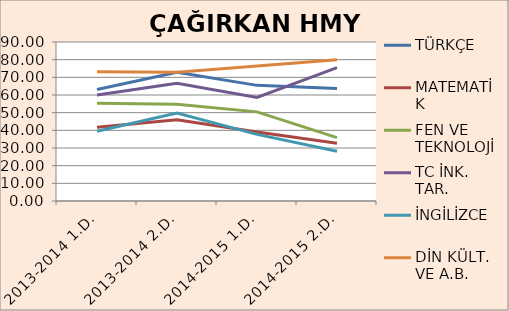
| Category | TÜRKÇE | MATEMATİK | FEN VE TEKNOLOJİ | TC İNK. TAR. | İNGİLİZCE | DİN KÜLT. VE A.B. |
|---|---|---|---|---|---|---|
| 2013-2014 1.D. | 63.16 | 41.81 | 55.4 | 60 | 39.47 | 73.16 |
| 2013-2014 2.D. | 72.89 | 46.05 | 54.74 | 66.58 | 49.74 | 72.89 |
| 2014-2015 1.D. | 65.45 | 39.09 | 50.45 | 58.64 | 37.73 | 76.36 |
| 2014-2015 2.D. | 63.64 | 32.73 | 35.91 | 75.45 | 28.18 | 80 |